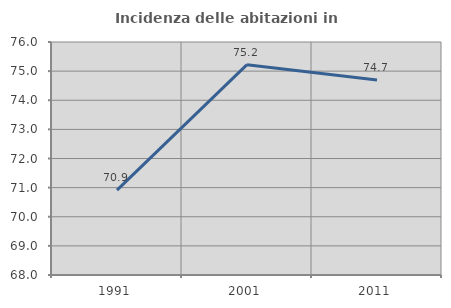
| Category | Incidenza delle abitazioni in proprietà  |
|---|---|
| 1991.0 | 70.916 |
| 2001.0 | 75.223 |
| 2011.0 | 74.697 |